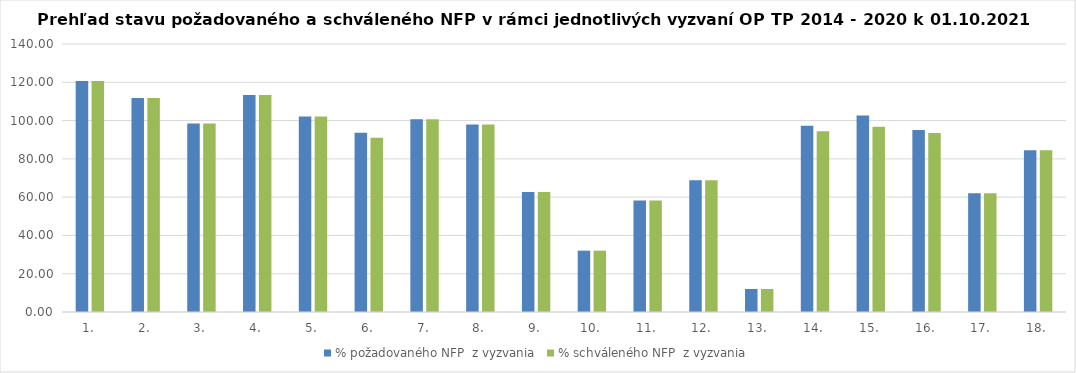
| Category | % požadovaného NFP  z vyzvania | % schváleného NFP  z vyzvania |
|---|---|---|
| 1. | 120.662 | 120.662 |
| 2. | 111.83 | 111.83 |
| 3. | 98.465 | 98.465 |
| 4. | 113.295 | 113.295 |
| 5. | 102.19 | 102.19 |
| 6. | 93.673 | 91.016 |
| 7. | 100.637 | 100.637 |
| 8. | 97.989 | 97.989 |
| 9. | 62.721 | 62.721 |
| 10. | 32.038 | 32.038 |
| 11. | 58.283 | 58.283 |
| 12. | 68.88 | 68.88 |
| 13. | 12.008 | 12.008 |
| 14. | 97.336 | 94.462 |
| 15. | 102.681 | 96.747 |
| 16. | 95.126 | 93.51 |
| 17. | 61.969 | 61.969 |
| 18. | 84.514 | 84.514 |